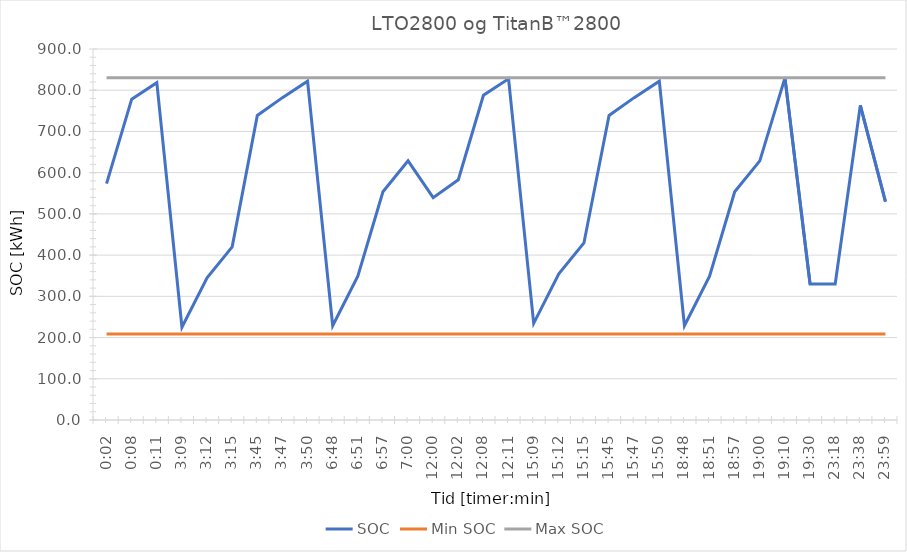
| Category | SOC | Min SOC | Max SOC |
|---|---|---|---|
| 0.001388888888888889 | 573.333 | 208.333 | 830 |
| 0.005555555555555556 | 778.333 | 208.333 | 830 |
| 0.007638888888888889 | 818.333 | 208.333 | 830 |
| 0.13125 | 225 | 208.333 | 830 |
| 0.13333333333333333 | 345 | 208.333 | 830 |
| 0.13541666666666666 | 420 | 208.333 | 830 |
| 0.15625 | 738.7 | 208.333 | 830 |
| 0.15763888888888888 | 782.033 | 208.333 | 830 |
| 0.15972222222222224 | 822.033 | 208.333 | 830 |
| 0.2833333333333333 | 228.7 | 208.333 | 830 |
| 0.28541666666666665 | 348.7 | 208.333 | 830 |
| 0.28958333333333336 | 553.7 | 208.333 | 830 |
| 0.2916666666666667 | 628.7 | 208.333 | 830 |
| 0.5 | 539.5 | 208.333 | 830 |
| 0.5013888888888889 | 582.833 | 208.333 | 830 |
| 0.5055555555555555 | 787.833 | 208.333 | 830 |
| 0.5076388888888889 | 827.833 | 208.333 | 830 |
| 0.63125 | 234.5 | 208.333 | 830 |
| 0.6333333333333333 | 354.5 | 208.333 | 830 |
| 0.6354166666666666 | 429.5 | 208.333 | 830 |
| 0.65625 | 738.7 | 208.333 | 830 |
| 0.6576388888888889 | 782.033 | 208.333 | 830 |
| 0.6597222222222222 | 822.033 | 208.333 | 830 |
| 0.7833333333333333 | 228.7 | 208.333 | 830 |
| 0.7854166666666668 | 348.7 | 208.333 | 830 |
| 0.7895833333333333 | 553.7 | 208.333 | 830 |
| 0.7916666666666666 | 628.7 | 208.333 | 830 |
| 0.7986111111111112 | 830 | 208.333 | 830 |
| 0.8125 | 330 | 208.333 | 830 |
| 0.9708333333333333 | 330 | 208.333 | 830 |
| 0.9847222222222222 | 763.333 | 208.333 | 830 |
| 0.9993055555555556 | 530 | 208.333 | 830 |